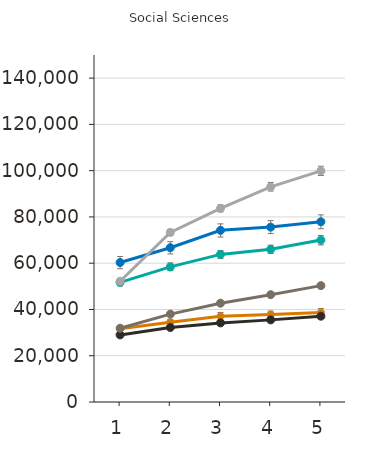
| Category | College-level Certificate | College-level Diploma | Bachelor's Degree | Master's Degree | Doctoral Degree | Professional Degree |
|---|---|---|---|---|---|---|
| 1.0 | 31700 | 29000 | 31900 | 51700 | 60300 | 52200 |
| 2.0 | 34500 | 32200 | 38000 | 58400 | 66700 | 73300 |
| 3.0 | 37100 | 34200 | 42700 | 63800 | 74200 | 83700 |
| 4.0 | 37800 | 35500 | 46400 | 66000 | 75600 | 93000 |
| 5.0 | 38700 | 37100 | 50300 | 70000 | 77900 | 99900 |